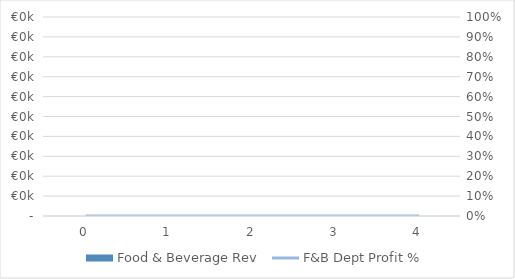
| Category | Food & Beverage Rev |
|---|---|
| 0.0 | 0 |
| 1.0 | 0 |
| 2.0 | 0 |
| 3.0 | 0 |
| 4.0 | 0 |